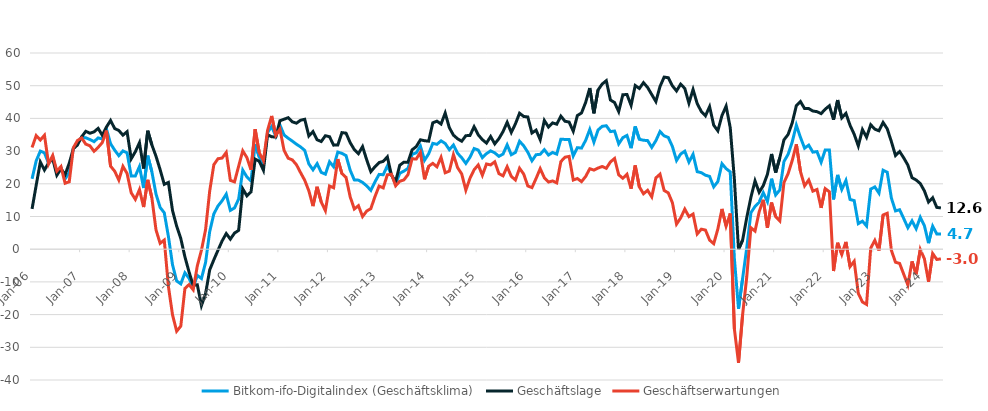
| Category | Bitkom-ifo-Digitalindex (Geschäftsklima) | Geschäftslage | Geschäftserwartungen |
|---|---|---|---|
| 2006-01-01 | 21.52 | 12.32 | 31.11 |
| 2006-02-01 | 27.02 | 19.56 | 34.74 |
| 2006-03-01 | 30 | 26.65 | 33.39 |
| 2006-04-01 | 29.47 | 24.21 | 34.85 |
| 2006-05-01 | 26.23 | 26.4 | 26.06 |
| 2006-06-01 | 28.19 | 27.7 | 28.67 |
| 2006-07-01 | 23.25 | 22.62 | 23.89 |
| 2006-08-01 | 24.94 | 24.58 | 25.29 |
| 2006-09-01 | 21.49 | 22.81 | 20.17 |
| 2006-10-01 | 23.44 | 26.29 | 20.62 |
| 2006-11-01 | 30.9 | 30.74 | 31.05 |
| 2006-12-01 | 32.56 | 31.87 | 33.25 |
| 2007-01-01 | 34.21 | 34.38 | 34.03 |
| 2007-02-01 | 34.08 | 36.05 | 32.12 |
| 2007-03-01 | 33.54 | 35.47 | 31.63 |
| 2007-04-01 | 32.89 | 35.89 | 29.93 |
| 2007-05-01 | 34.03 | 36.95 | 31.15 |
| 2007-06-01 | 33.72 | 34.84 | 32.61 |
| 2007-07-01 | 36.8 | 37.35 | 36.26 |
| 2007-08-01 | 32.27 | 39.36 | 25.39 |
| 2007-09-01 | 30.29 | 36.91 | 23.86 |
| 2007-10-01 | 28.6 | 36.3 | 21.15 |
| 2007-11-01 | 30.06 | 34.88 | 25.33 |
| 2007-12-01 | 29.46 | 35.94 | 23.15 |
| 2008-01-01 | 22.38 | 27.64 | 17.25 |
| 2008-02-01 | 22.41 | 29.82 | 15.24 |
| 2008-03-01 | 25.29 | 32.58 | 18.23 |
| 2008-04-01 | 18.7 | 24.67 | 12.89 |
| 2008-05-01 | 28.6 | 36.23 | 21.21 |
| 2008-06-01 | 23.65 | 31.9 | 15.7 |
| 2008-07-01 | 16.87 | 28.43 | 5.9 |
| 2008-08-01 | 12.76 | 24.32 | 1.8 |
| 2008-09-01 | 11.15 | 19.83 | 2.8 |
| 2008-10-01 | 3.91 | 20.42 | -11.37 |
| 2008-11-01 | -4.77 | 11.83 | -20.07 |
| 2008-12-01 | -9.7 | 7.05 | -25.09 |
| 2009-01-01 | -10.6 | 3.26 | -23.52 |
| 2009-02-01 | -7.23 | -2.35 | -12 |
| 2009-03-01 | -8.9 | -6.96 | -10.83 |
| 2009-04-01 | -11.73 | -11.06 | -12.4 |
| 2009-05-01 | -8.01 | -10.88 | -5.1 |
| 2009-06-01 | -8.97 | -17.25 | -0.3 |
| 2009-07-01 | -4.06 | -13.62 | 5.98 |
| 2009-08-01 | 5.4 | -6.31 | 17.81 |
| 2009-09-01 | 10.8 | -3.24 | 25.84 |
| 2009-10-01 | 13.21 | -0.32 | 27.66 |
| 2009-11-01 | 14.82 | 2.52 | 27.87 |
| 2009-12-01 | 16.83 | 4.78 | 29.59 |
| 2010-01-01 | 11.87 | 3.08 | 21.05 |
| 2010-02-01 | 12.61 | 4.93 | 20.58 |
| 2010-03-01 | 15.33 | 5.75 | 25.36 |
| 2010-04-01 | 24.19 | 18.46 | 30.08 |
| 2010-05-01 | 22.09 | 16.31 | 28.01 |
| 2010-06-01 | 20.88 | 17.53 | 24.29 |
| 2010-07-01 | 32.08 | 27.55 | 36.7 |
| 2010-08-01 | 28.18 | 26.88 | 29.49 |
| 2010-09-01 | 25.6 | 24.15 | 27.06 |
| 2010-10-01 | 35.67 | 35.02 | 36.33 |
| 2010-11-01 | 37.55 | 34.38 | 40.75 |
| 2010-12-01 | 34.53 | 34.3 | 34.76 |
| 2011-01-01 | 37.99 | 39.28 | 36.7 |
| 2011-02-01 | 34.93 | 39.75 | 30.21 |
| 2011-03-01 | 33.94 | 40.22 | 27.82 |
| 2011-04-01 | 33.06 | 38.95 | 27.31 |
| 2011-05-01 | 32.1 | 38.54 | 25.83 |
| 2011-06-01 | 31.28 | 39.44 | 23.4 |
| 2011-07-01 | 30.21 | 39.73 | 21.08 |
| 2011-08-01 | 26.08 | 34.63 | 17.84 |
| 2011-09-01 | 24.28 | 35.96 | 13.18 |
| 2011-10-01 | 26.16 | 33.46 | 19.08 |
| 2011-11-01 | 23.49 | 32.93 | 14.43 |
| 2011-12-01 | 22.95 | 34.7 | 11.79 |
| 2012-01-01 | 26.74 | 34.4 | 19.33 |
| 2012-02-01 | 25.21 | 31.82 | 18.79 |
| 2012-03-01 | 29.7 | 31.88 | 27.53 |
| 2012-04-01 | 29.31 | 35.65 | 23.13 |
| 2012-05-01 | 28.62 | 35.49 | 21.96 |
| 2012-06-01 | 24.16 | 32.59 | 16.03 |
| 2012-07-01 | 21.19 | 30.46 | 12.3 |
| 2012-08-01 | 21.12 | 29.22 | 13.31 |
| 2012-09-01 | 20.42 | 31.37 | 9.99 |
| 2012-10-01 | 19.36 | 27.34 | 11.66 |
| 2012-11-01 | 17.99 | 23.71 | 12.41 |
| 2012-12-01 | 20.59 | 25.21 | 16.07 |
| 2013-01-01 | 22.87 | 26.5 | 19.31 |
| 2013-02-01 | 22.77 | 26.86 | 18.75 |
| 2013-03-01 | 25.49 | 28.24 | 22.76 |
| 2013-04-01 | 22.76 | 22.6 | 22.92 |
| 2013-05-01 | 20.04 | 20.69 | 19.39 |
| 2013-06-01 | 23.21 | 25.68 | 20.77 |
| 2013-07-01 | 23.88 | 26.61 | 21.18 |
| 2013-08-01 | 24.7 | 26.6 | 22.82 |
| 2013-09-01 | 29.02 | 30.39 | 27.65 |
| 2013-10-01 | 29.48 | 31.39 | 27.59 |
| 2013-11-01 | 31.53 | 33.46 | 29.62 |
| 2013-12-01 | 27.2 | 33.17 | 21.38 |
| 2014-01-01 | 29.17 | 33.05 | 25.36 |
| 2014-02-01 | 32.37 | 38.65 | 26.25 |
| 2014-03-01 | 32.08 | 39.16 | 25.2 |
| 2014-04-01 | 33.14 | 38.28 | 28.1 |
| 2014-05-01 | 32.33 | 41.64 | 23.37 |
| 2014-06-01 | 30.43 | 37.17 | 23.88 |
| 2014-07-01 | 31.87 | 34.88 | 28.9 |
| 2014-08-01 | 29.32 | 33.77 | 24.95 |
| 2014-09-01 | 27.96 | 33.02 | 23.01 |
| 2014-10-01 | 26.24 | 34.72 | 18.06 |
| 2014-11-01 | 28.12 | 34.76 | 21.68 |
| 2014-12-01 | 30.78 | 37.46 | 24.29 |
| 2015-01-01 | 30.33 | 34.97 | 25.77 |
| 2015-02-01 | 27.99 | 33.5 | 22.62 |
| 2015-03-01 | 29.23 | 32.45 | 26.06 |
| 2015-04-01 | 30.08 | 34.46 | 25.78 |
| 2015-05-01 | 29.46 | 32.21 | 26.73 |
| 2015-06-01 | 28.4 | 33.8 | 23.12 |
| 2015-07-01 | 29.1 | 35.97 | 22.43 |
| 2015-08-01 | 31.91 | 38.8 | 25.22 |
| 2015-09-01 | 28.89 | 35.71 | 22.27 |
| 2015-10-01 | 29.59 | 38.33 | 21.17 |
| 2015-11-01 | 33.01 | 41.58 | 24.75 |
| 2015-12-01 | 31.62 | 40.6 | 22.98 |
| 2016-01-01 | 29.65 | 40.44 | 19.34 |
| 2016-02-01 | 27.03 | 35.54 | 18.83 |
| 2016-03-01 | 28.89 | 36.41 | 21.62 |
| 2016-04-01 | 29.02 | 33.49 | 24.63 |
| 2016-05-01 | 30.44 | 39.37 | 21.85 |
| 2016-06-01 | 28.8 | 37.37 | 20.53 |
| 2016-07-01 | 29.59 | 38.63 | 20.88 |
| 2016-08-01 | 29.07 | 38.22 | 20.28 |
| 2016-09-01 | 33.63 | 40.69 | 26.79 |
| 2016-10-01 | 33.57 | 39.13 | 28.14 |
| 2016-11-01 | 33.57 | 38.87 | 28.38 |
| 2016-12-01 | 28.5 | 36.08 | 21.16 |
| 2017-01-01 | 31.05 | 40.88 | 21.61 |
| 2017-02-01 | 30.92 | 41.66 | 20.66 |
| 2017-03-01 | 33.28 | 44.88 | 22.24 |
| 2017-04-01 | 36.62 | 49.28 | 24.6 |
| 2017-05-01 | 32.72 | 41.56 | 24.2 |
| 2017-06-01 | 36.45 | 48.69 | 24.81 |
| 2017-07-01 | 37.57 | 50.51 | 25.3 |
| 2017-08-01 | 37.76 | 51.53 | 24.74 |
| 2017-09-01 | 35.97 | 45.63 | 26.69 |
| 2017-10-01 | 36.14 | 44.85 | 27.74 |
| 2017-11-01 | 32.22 | 42.08 | 22.75 |
| 2017-12-01 | 34.11 | 47.23 | 21.69 |
| 2018-01-01 | 34.79 | 47.31 | 22.91 |
| 2018-02-01 | 30.9 | 43.99 | 18.51 |
| 2018-03-01 | 37.53 | 50.06 | 25.62 |
| 2018-04-01 | 33.61 | 49.15 | 19.05 |
| 2018-05-01 | 33.32 | 50.93 | 16.95 |
| 2018-06-01 | 33.21 | 49.46 | 18.01 |
| 2018-07-01 | 31.13 | 47.3 | 16.01 |
| 2018-08-01 | 33.19 | 45.16 | 21.8 |
| 2018-09-01 | 35.97 | 49.75 | 22.94 |
| 2018-10-01 | 34.67 | 52.64 | 17.96 |
| 2018-11-01 | 34.17 | 52.43 | 17.22 |
| 2018-12-01 | 31.41 | 49.97 | 14.22 |
| 2019-01-01 | 27.13 | 48.4 | 7.68 |
| 2019-02-01 | 29.11 | 50.48 | 9.55 |
| 2019-03-01 | 29.97 | 49.15 | 12.27 |
| 2019-04-01 | 26.64 | 44.65 | 9.96 |
| 2019-05-01 | 29.01 | 48.84 | 10.75 |
| 2019-06-01 | 23.71 | 44.53 | 4.66 |
| 2019-07-01 | 23.4 | 42.11 | 6.13 |
| 2019-08-01 | 22.63 | 40.79 | 5.85 |
| 2019-09-01 | 22.26 | 43.59 | 2.79 |
| 2019-10-01 | 19.06 | 37.92 | 1.69 |
| 2019-11-01 | 20.68 | 36.2 | 6.17 |
| 2019-12-01 | 26.14 | 40.88 | 12.31 |
| 2020-01-01 | 24.65 | 43.74 | 7.06 |
| 2020-02-01 | 23.65 | 37.15 | 10.92 |
| 2020-03-01 | -2.83 | 21.39 | -24.4 |
| 2020-04-01 | -18.22 | -0.07 | -34.73 |
| 2020-05-01 | -8.92 | 2.79 | -19.96 |
| 2020-06-01 | 0.44 | 9.72 | -8.43 |
| 2020-07-01 | 11.15 | 15.85 | 6.56 |
| 2020-08-01 | 13.06 | 20.88 | 5.53 |
| 2020-09-01 | 14.38 | 17.38 | 11.43 |
| 2020-10-01 | 17.27 | 19.46 | 15.11 |
| 2020-11-01 | 14.57 | 22.93 | 6.53 |
| 2020-12-01 | 21.57 | 29.13 | 14.26 |
| 2021-01-01 | 16.59 | 23.44 | 9.95 |
| 2021-02-01 | 18.11 | 27.98 | 8.66 |
| 2021-03-01 | 26.81 | 33.44 | 20.38 |
| 2021-04-01 | 29.01 | 35.07 | 23.09 |
| 2021-05-01 | 32.79 | 38.61 | 27.11 |
| 2021-06-01 | 37.92 | 43.9 | 32.08 |
| 2021-07-01 | 34.19 | 45.14 | 23.74 |
| 2021-08-01 | 30.89 | 43 | 19.38 |
| 2021-09-01 | 31.83 | 43 | 21.17 |
| 2021-10-01 | 29.68 | 42.26 | 17.75 |
| 2021-11-01 | 29.85 | 42.06 | 18.27 |
| 2021-12-01 | 26.59 | 41.46 | 12.63 |
| 2022-01-01 | 30.35 | 42.83 | 18.51 |
| 2022-02-01 | 30.35 | 43.87 | 17.59 |
| 2022-03-01 | 15.22 | 39.61 | -6.68 |
| 2022-04-01 | 22.72 | 45.61 | 1.97 |
| 2022-05-01 | 18.28 | 40.15 | -1.6 |
| 2022-06-01 | 21.02 | 41.54 | 2.23 |
| 2022-07-01 | 15.2 | 37.89 | -5.32 |
| 2022-08-01 | 14.87 | 35.17 | -3.68 |
| 2022-09-01 | 7.81 | 31.59 | -13.52 |
| 2022-10-01 | 8.57 | 36.59 | -16.14 |
| 2022-11-01 | 7.1 | 34.23 | -16.89 |
| 2022-12-01 | 18.39 | 38.07 | 0.34 |
| 2023-01-01 | 19.04 | 36.7 | 2.71 |
| 2023-02-01 | 17.14 | 36.21 | -0.39 |
| 2023-03-01 | 24.16 | 38.75 | 10.46 |
| 2023-04-01 | 23.54 | 36.83 | 10.99 |
| 2023-05-01 | 15.66 | 32.92 | -0.33 |
| 2023-06-01 | 11.71 | 28.66 | -3.98 |
| 2023-07-01 | 12.07 | 29.87 | -4.35 |
| 2023-08-01 | 9.37 | 27.92 | -7.67 |
| 2023-09-01 | 6.56 | 25.7 | -10.96 |
| 2023-10-01 | 8.68 | 21.86 | -3.72 |
| 2023-11-01 | 6.26 | 21.17 | -7.65 |
| 2023-12-01 | 9.76 | 20.08 | -0.07 |
| 2024-01-01 | 7.17 | 17.81 | -2.95 |
| 2024-02-01 | 1.85 | 14.42 | -9.98 |
| 2024-03-01 | 7.03 | 15.74 | -1.33 |
| 2024-04-01 | 4.66 | 12.78 | -3.14 |
| 2024-05-01 | 4.68 | 12.62 | -2.96 |